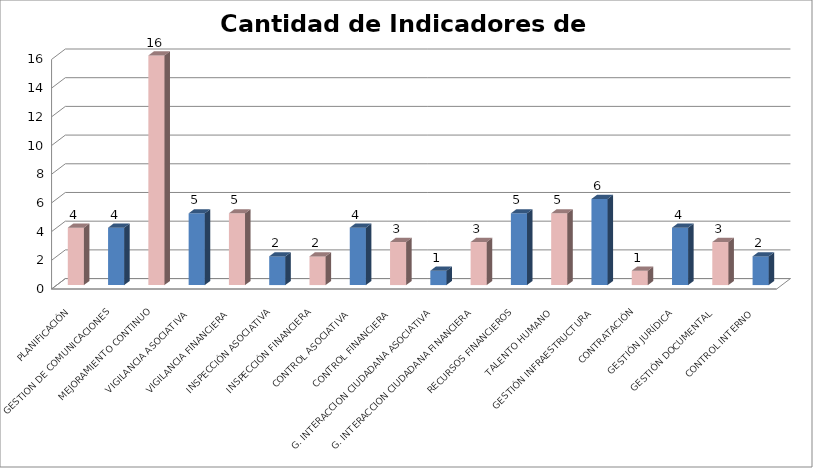
| Category | Series 0 |
|---|---|
| PLANIFICACIÓN | 4 |
| GESTION DE COMUNICACIONES | 4 |
| MEJORAMIENTO CONTINUO | 16 |
| VIGILANCIA ASOCIATIVA | 5 |
| VIGILANCIA FINANCIERA | 5 |
| INSPECCIÓN ASOCIATIVA | 2 |
| INSPECCIÓN FINANCIERA | 2 |
| CONTROL ASOCIATIVA | 4 |
| CONTROL FINANCIERA | 3 |
| G. INTERACCION CIUDADANA ASOCIATIVA | 1 |
| G. INTERACCION CIUDADANA FINANCIERA | 3 |
| RECURSOS FINANCIEROS | 5 |
| TALENTO HUMANO | 5 |
| GESTIÓN INFRAESTRUCTURA | 6 |
| CONTRATACIÓN | 1 |
| GESTIÓN JURÍDICA | 4 |
| GESTIÓN DOCUMENTAL | 3 |
| CONTROL INTERNO | 2 |